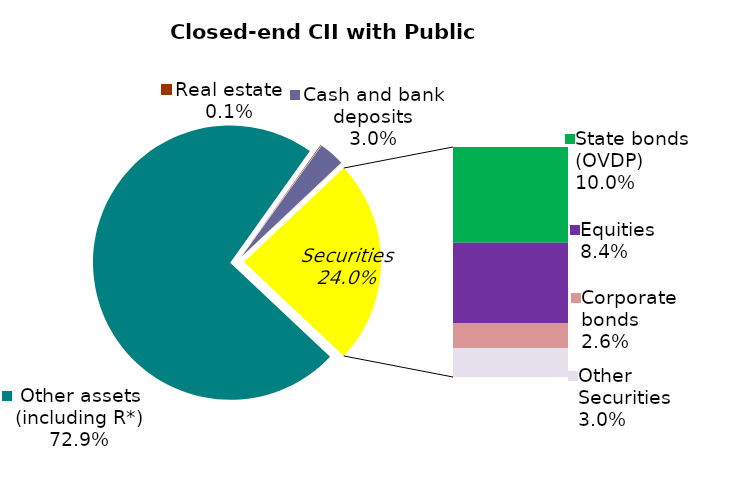
| Category | Series 0 |
|---|---|
| Other assets (including R*) | 0.729 |
| Real estate | 0.001 |
| Cash and bank deposits | 0.03 |
| Bank metals | 0 |
| State bonds (OVDP) | 0.1 |
| Equities | 0.084 |
| Corporate bonds | 0.026 |
| Other Securities | 0.03 |